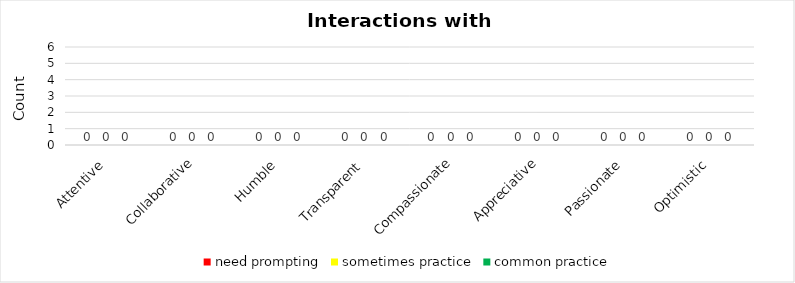
| Category | need prompting | sometimes practice | common practice |
|---|---|---|---|
| Attentive | 0 | 0 | 0 |
| Collaborative | 0 | 0 | 0 |
| Humble | 0 | 0 | 0 |
| Transparent | 0 | 0 | 0 |
| Compassionate | 0 | 0 | 0 |
| Appreciative | 0 | 0 | 0 |
| Passionate | 0 | 0 | 0 |
| Optimistic | 0 | 0 | 0 |